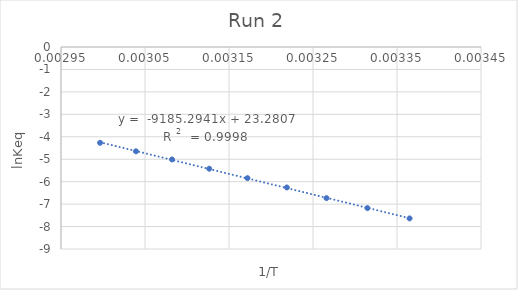
| Category | SINEt repeat-1 |
|---|---|
| 0.003364963994885255 | -7.637 |
| 0.003314770617873243 | -7.178 |
| 0.0032660526487686982 | -6.734 |
| 0.0032188495831589788 | -6.258 |
| 0.003171985028230667 | -5.843 |
| 0.0031264655307175235 | -5.423 |
| 0.0030821390044691015 | -5.011 |
| 0.0030392365437802026 | -4.647 |
| 0.002996524032122737 | -4.269 |